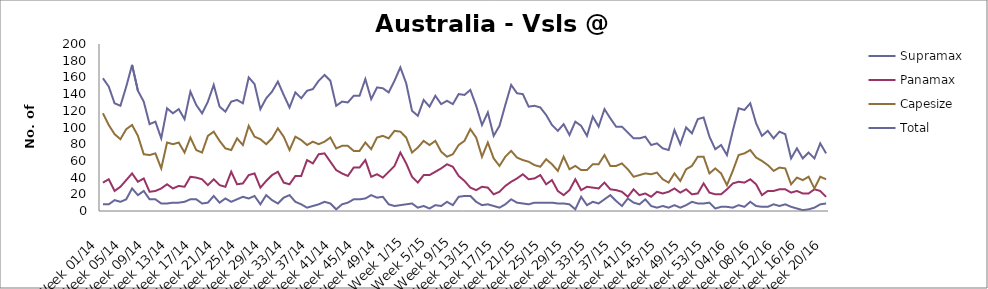
| Category | Supramax | Panamax | Capesize | Total |
|---|---|---|---|---|
| Week 01/14 | 8 | 34 | 117 | 159 |
| Week 02/14 | 8 | 38 | 103 | 149 |
| Week 03/14 | 13 | 24 | 92 | 129 |
| Week 04/14 | 11 | 29 | 86 | 126 |
| Week 05/14 | 14 | 37 | 98 | 149 |
| Week 06/14 | 27 | 45 | 103 | 175 |
| Week 07/14 | 19 | 35 | 90 | 144 |
| Week 08/14 | 24 | 39 | 68 | 131 |
| Week 09/14 | 14 | 23 | 67 | 104 |
| Week 10/14 | 14 | 24 | 69 | 107 |
| Week 11/14 | 9 | 27 | 51 | 87 |
| Week 12/14 | 9 | 32 | 82 | 123 |
| Week 13/14 | 10 | 27 | 80 | 117 |
| Week 14/14 | 10 | 30 | 82 | 122 |
| Week 15/14 | 11 | 29 | 70 | 110 |
| Week 16/14 | 14 | 41 | 88 | 143 |
| Week 17/14 | 14 | 40 | 73 | 127 |
| Week 18/14 | 9 | 38 | 70 | 117 |
| Week 19/14 | 10 | 31 | 90 | 131 |
| Week 20/14 | 18 | 38 | 95 | 151 |
| Week 21/14 | 10 | 31 | 84 | 125 |
| Week 22/14 | 15 | 29 | 75 | 119 |
| Week 23/14 | 11 | 47 | 73 | 131 |
| Week 24/14 | 14 | 32 | 87 | 133 |
| Week 25/14 | 17 | 33 | 79 | 129 |
| Week 26/14 | 15 | 43 | 102 | 160 |
| Week 27/14 | 18 | 45 | 89 | 152 |
| Week 28/14 | 8 | 28 | 86 | 122 |
| Week 29/14 | 19 | 36 | 80 | 135 |
| Week 30/14 | 13 | 43 | 87 | 143 |
| Week 31/14 | 9 | 47 | 99 | 155 |
| Week 32/14 | 16 | 34 | 89 | 139 |
| Week 33/14 | 19 | 32 | 73 | 124 |
| Week 34/14 | 11 | 42 | 89 | 142 |
| Week 35/14 | 8 | 42 | 85 | 135 |
| Week 36/14 | 4 | 61 | 79 | 144 |
| Week 37/14 | 6 | 57 | 83 | 146 |
| Week 38/14 | 8 | 68 | 80 | 156 |
| Week 39/14 | 11 | 69 | 83 | 163 |
| Week 40/14 | 9 | 59 | 88 | 156 |
| Week 41/14 | 2 | 49 | 75 | 126 |
| Week 42/14 | 8 | 45 | 78 | 131 |
| Week 43/14 | 10 | 42 | 78 | 130 |
| Week 44/14 | 14 | 52 | 72 | 138 |
| Week 45/14 | 14 | 52 | 72 | 138 |
| Week 46/14 | 15 | 61 | 82 | 158 |
| Week 47/14 | 19 | 41 | 74 | 134 |
| Week 48/14 | 16 | 44 | 88 | 148 |
| Week 49/14 | 17 | 40 | 90 | 147 |
| Week 50/14 | 8 | 47 | 87 | 142 |
| Week 51/14 | 6 | 54 | 96 | 156 |
| Week 52/14 | 7 | 70 | 95 | 172 |
| Week 1/15 | 8 | 57 | 88 | 153 |
| Week 2/15 | 9 | 41 | 70 | 120 |
| Week 3/15 | 4 | 34 | 76 | 114 |
| Week 4/15 | 6 | 43 | 84 | 133 |
| Week 5/15 | 3 | 43 | 79 | 125 |
| Week 6/15 | 7 | 47 | 84 | 138 |
| Week 7/15 | 6 | 51 | 71 | 128 |
| Week 8/15 | 11 | 56 | 65 | 132 |
| Week 9/15 | 7 | 53 | 68 | 128 |
| Week 10/15 | 17 | 42 | 79 | 140 |
| Week 11/15 | 18 | 36 | 84 | 139 |
| Week 12/15 | 18 | 28 | 98 | 145 |
| Week 13/15 | 11 | 25 | 88 | 126 |
| Week 14/15 | 7 | 29 | 65 | 103 |
| Week 15/15 | 8 | 28 | 82 | 118 |
| Week 16/15 | 6 | 20 | 63 | 90 |
| Week 17/15 | 4 | 23 | 54 | 102 |
| Week 18/15 | 8 | 30 | 65 | 127 |
| Week 19/15 | 14 | 35 | 72 | 151 |
| Week 20/15 | 10 | 39 | 64 | 141 |
| Week 21/15 | 9 | 44 | 61 | 140 |
| Week 22/15 | 8 | 38 | 59 | 125 |
| Week 23/15 | 10 | 39 | 55 | 126 |
| Week 24/15 | 10 | 43 | 53 | 124 |
| Week 25/15 | 10 | 32 | 62 | 115 |
| Week 26/15 | 10 | 37 | 56 | 103 |
| Week 27/15 | 9 | 24 | 48 | 96 |
| Week 28/15 | 9 | 19 | 65 | 104 |
| Week 29/15 | 8 | 25 | 50 | 91 |
| Week 30/15 | 2 | 38 | 54 | 107 |
| Week 31/15 | 17 | 25 | 49 | 102 |
| Week 32/15 | 7 | 29 | 49 | 90 |
| Week 33/15 | 11 | 28 | 56 | 113 |
| Week 34/15 | 9 | 27 | 56 | 101 |
| Week 35/15 | 14 | 34 | 67 | 122 |
| Week 36/15 | 19 | 26 | 54 | 111 |
| Week 37/15 | 12 | 25 | 54 | 101 |
| Week 38/15 | 6 | 23 | 57 | 101 |
| Week 39/15 | 15 | 17 | 50 | 94 |
| Week 40/15 | 10 | 26 | 41 | 87 |
| Week 41/15 | 8 | 19 | 43 | 87 |
| Week 42/15 | 14 | 21 | 45 | 89 |
| Week 43/15 | 6 | 17 | 44 | 79 |
| Week 44/15 | 4 | 23 | 46 | 81 |
| Week 45/15 | 6 | 21 | 38 | 75 |
| Week 46/15 | 4 | 23 | 34 | 73 |
| Week 47/15 | 7 | 27 | 45 | 97 |
| Week 48/15 | 4 | 22 | 36 | 80 |
| Week 49/15 | 7 | 26 | 50 | 100 |
| Week 50/15 | 11 | 20 | 54 | 93 |
| Week 51/15 | 9 | 21 | 65 | 110 |
| Week 52/15 | 9 | 33 | 65 | 112 |
| Week 53/15 | 10 | 22 | 45 | 89 |
| Week 01/16 | 3 | 20 | 51 | 74 |
| Week 02/16 | 5 | 20 | 45 | 79 |
| Week 03/16 | 5 | 26 | 31 | 67 |
| Week 04/16 | 4 | 33 | 48 | 96 |
| Week 05/16 | 7 | 35 | 67 | 123 |
| Week 06/16 | 5 | 34 | 69 | 121 |
| Week 07/16 | 11 | 38 | 73 | 129 |
| Week 08/16 | 6 | 32 | 64 | 105 |
| Week 09/16 | 5 | 19 | 60 | 90 |
| Week 10/16 | 5 | 24 | 55 | 96 |
| Week 11/16 | 8 | 24 | 48 | 87 |
| Week 12/16 | 6 | 26 | 52 | 95 |
| Week 13/16 | 8 | 26 | 51 | 92 |
| Week 14/16 | 5 | 22 | 32 | 63 |
| Week 15/16 | 3 | 24 | 40 | 75 |
| Week 16/16 | 1 | 21 | 37 | 63 |
| Week 17/16 | 2 | 21 | 41 | 70 |
| Week 18/16 | 4 | 26 | 27 | 63 |
| Week 19/16 | 8 | 24 | 41 | 81 |
| Week 20/16 | 9 | 17 | 38 | 69 |